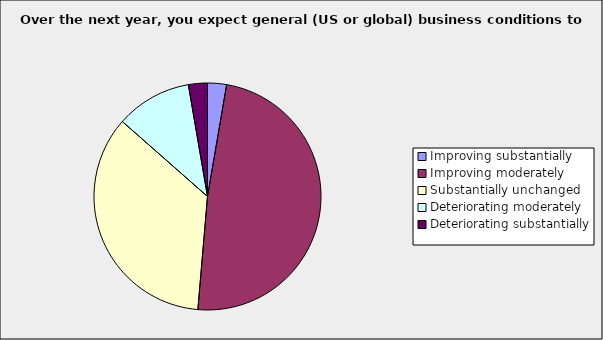
| Category | Series 0 |
|---|---|
| Improving substantially | 0.027 |
| Improving moderately | 0.486 |
| Substantially unchanged | 0.351 |
| Deteriorating moderately | 0.108 |
| Deteriorating substantially | 0.027 |